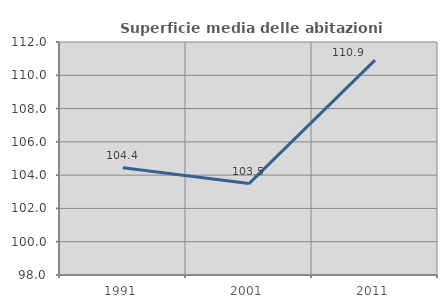
| Category | Superficie media delle abitazioni occupate |
|---|---|
| 1991.0 | 104.438 |
| 2001.0 | 103.492 |
| 2011.0 | 110.908 |